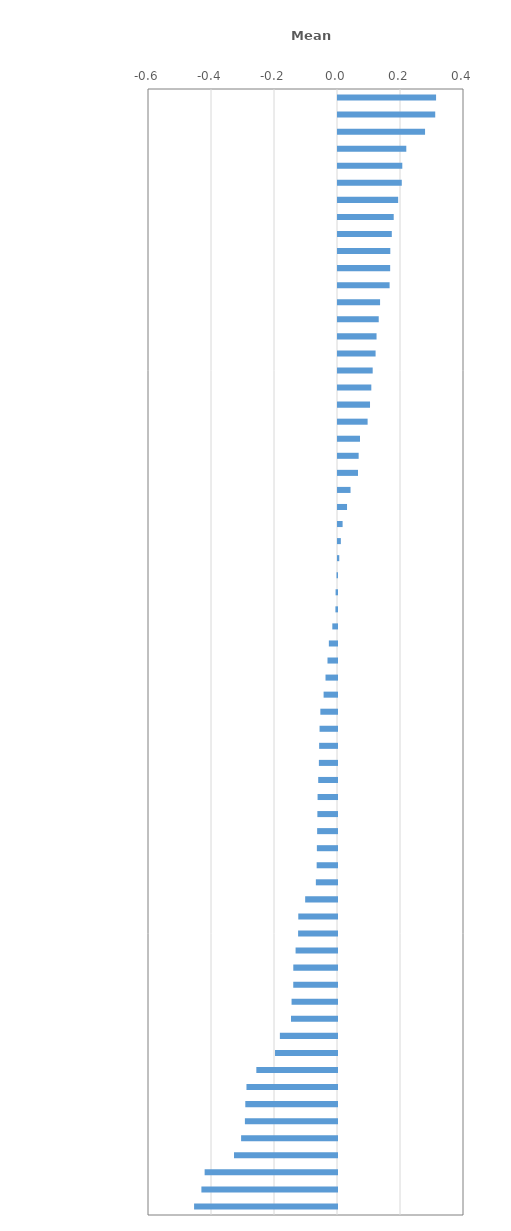
| Category | Mean index |
|---|---|
| Bosnia and Herzegovina | 0.311 |
| North Macedonia | 0.309 |
| Spain | 0.276 |
| Mexico | 0.217 |
| Turkey | 0.204 |
| Canada | 0.202 |
| Moldova | 0.191 |
| Jordan | 0.177 |
| Belarus | 0.171 |
| Montenegro | 0.166 |
| Albania | 0.166 |
| Romania | 0.164 |
| Ukraine | 0.134 |
| Australia | 0.129 |
| United Arab Emirates | 0.122 |
| Iceland | 0.119 |
| Ireland | 0.11 |
| Estonia | 0.106 |
| Russia | 0.102 |
| New Zealand | 0.094 |
| Malta | 0.07 |
| Germany | 0.066 |
| Poland | 0.063 |
| Costa Rica | 0.04 |
| Serbia | 0.029 |
| Kosovo | 0.015 |
| Dominican Republic | 0.009 |
| Lithuania | 0.004 |
| Switzerland | -0.002 |
| Slovenia | -0.005 |
| OECD average | -0.005 |
| Israel | -0.015 |
| Croatia | -0.026 |
| Baku (Azerbaijan) | -0.03 |
| Kazakhstan | -0.036 |
| Singapore | -0.043 |
| Latvia | -0.053 |
| Scotland (United Kingdom) | -0.055 |
| Peru | -0.057 |
| Panama | -0.058 |
| Bulgaria | -0.06 |
| Lebanon | -0.062 |
| Hungary | -0.062 |
| Saudi Arabia | -0.063 |
| Uruguay | -0.064 |
| Chile | -0.065 |
| Austria | -0.067 |
| Korea | -0.101 |
| Brazil | -0.123 |
| Philippines | -0.123 |
| Argentina | -0.131 |
| Indonesia | -0.139 |
| France | -0.139 |
| Colombia | -0.144 |
| Portugal | -0.146 |
| Chinese Taipei | -0.181 |
| Morocco | -0.197 |
| Slovak Republic | -0.256 |
| Hong Kong (China) | -0.287 |
| Greece | -0.291 |
| Thailand | -0.292 |
| Malaysia | -0.304 |
| Italy | -0.327 |
| Brunei Darussalam | -0.42 |
| Viet Nam | -0.43 |
| Macao (China) | -0.454 |